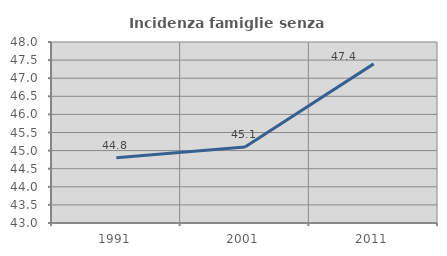
| Category | Incidenza famiglie senza nuclei |
|---|---|
| 1991.0 | 44.804 |
| 2001.0 | 45.101 |
| 2011.0 | 47.396 |